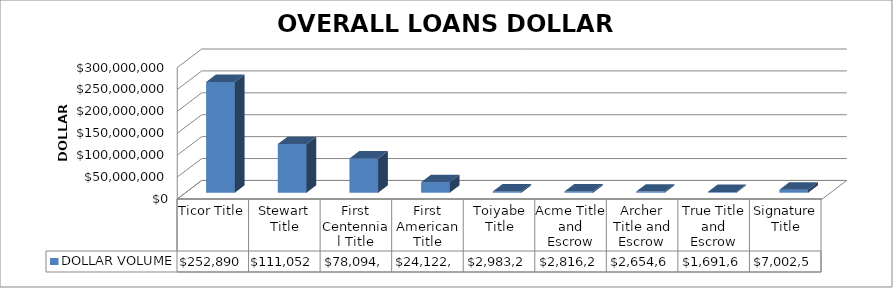
| Category | DOLLAR VOLUME |
|---|---|
| Ticor Title | 252890567.35 |
| Stewart Title | 111052898 |
| First Centennial Title | 78094025.7 |
| First American Title | 24122844.94 |
| Toiyabe Title | 2983233 |
| Acme Title and Escrow | 2816245 |
| Archer Title and Escrow | 2654683 |
| True Title and Escrow | 1691618 |
| Signature Title | 7002513 |